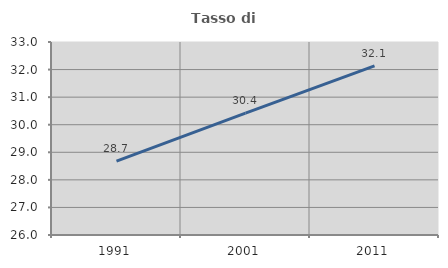
| Category | Tasso di occupazione   |
|---|---|
| 1991.0 | 28.679 |
| 2001.0 | 30.421 |
| 2011.0 | 32.136 |